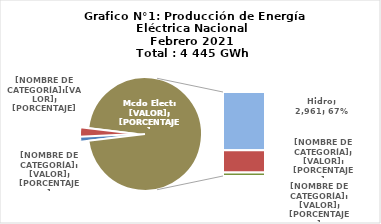
| Category | Series 0 |
|---|---|
| 0 | 50.647 |
| 1 | 119.882 |
| 2 | 2961.37 |
| 3 | 1134.732 |
| 4 | 177.921 |